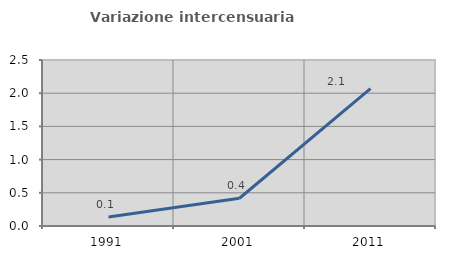
| Category | Variazione intercensuaria annua |
|---|---|
| 1991.0 | 0.136 |
| 2001.0 | 0.418 |
| 2011.0 | 2.069 |